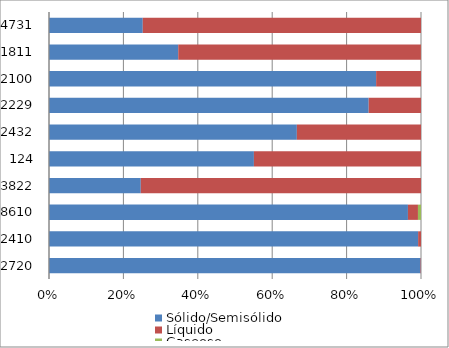
| Category | Sólido/Semisólido | Líquido | Gaseoso |
|---|---|---|---|
| 2720.0 | 4782875.8 | 5949 | 0 |
| 2410.0 | 2777655.92 | 21718 | 0 |
| 8610.0 | 861980.5 | 24057.6 | 7308.4 |
| 3822.0 | 190372.58 | 581216.35 | 0 |
| 124.0 | 283209.62 | 230922 | 0 |
| 2432.0 | 325627.78 | 163069 | 0 |
| 2229.0 | 403758.09 | 66049.24 | 0 |
| 2100.0 | 384941.42 | 52806.98 | 0 |
| 1811.0 | 136533 | 256413.7 | 52 |
| 4731.0 | 96178.16 | 285341.75 | 0 |